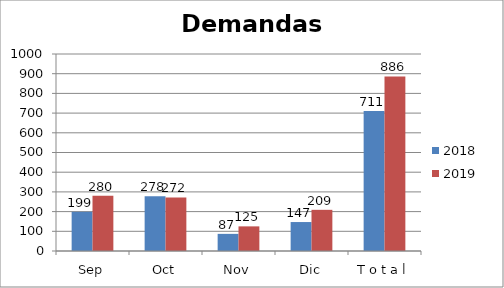
| Category | 2018 | 2019 |
|---|---|---|
| Sep | 199 | 280 |
| Oct | 278 | 272 |
| Nov | 87 | 125 |
| Dic | 147 | 209 |
| T o t a l | 711 | 886 |